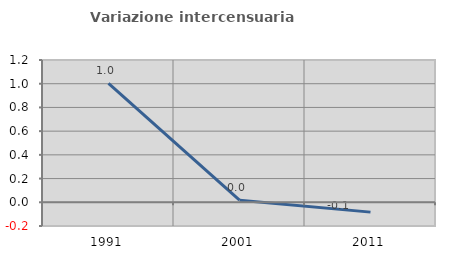
| Category | Variazione intercensuaria annua |
|---|---|
| 1991.0 | 1.002 |
| 2001.0 | 0.018 |
| 2011.0 | -0.083 |